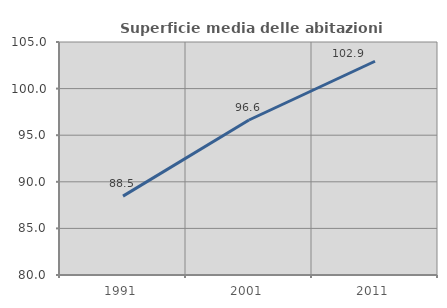
| Category | Superficie media delle abitazioni occupate |
|---|---|
| 1991.0 | 88.465 |
| 2001.0 | 96.631 |
| 2011.0 | 102.935 |